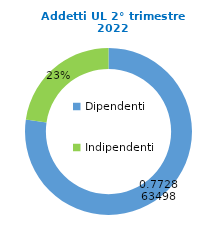
| Category | Series 0 |
|---|---|
| Dipendenti | 74528 |
| Indipendenti | 21903 |